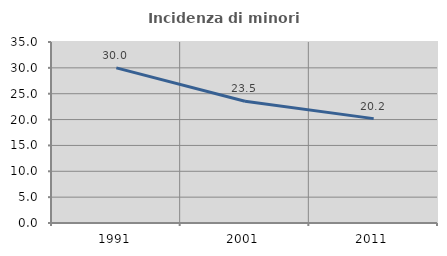
| Category | Incidenza di minori stranieri |
|---|---|
| 1991.0 | 30 |
| 2001.0 | 23.529 |
| 2011.0 | 20.183 |